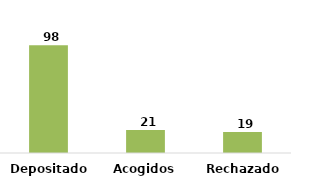
| Category | Series 0 |
|---|---|
| Depositados | 98 |
| Acogidos | 21 |
| Rechazados | 19 |